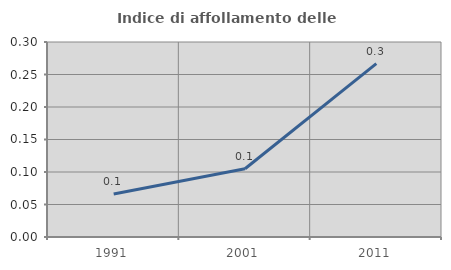
| Category | Indice di affollamento delle abitazioni  |
|---|---|
| 1991.0 | 0.066 |
| 2001.0 | 0.105 |
| 2011.0 | 0.267 |